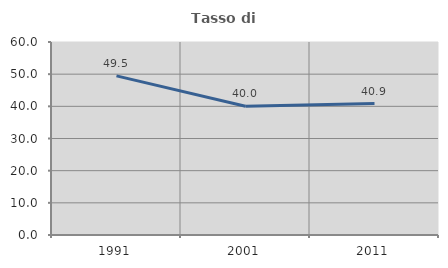
| Category | Tasso di occupazione   |
|---|---|
| 1991.0 | 49.466 |
| 2001.0 | 40 |
| 2011.0 | 40.873 |